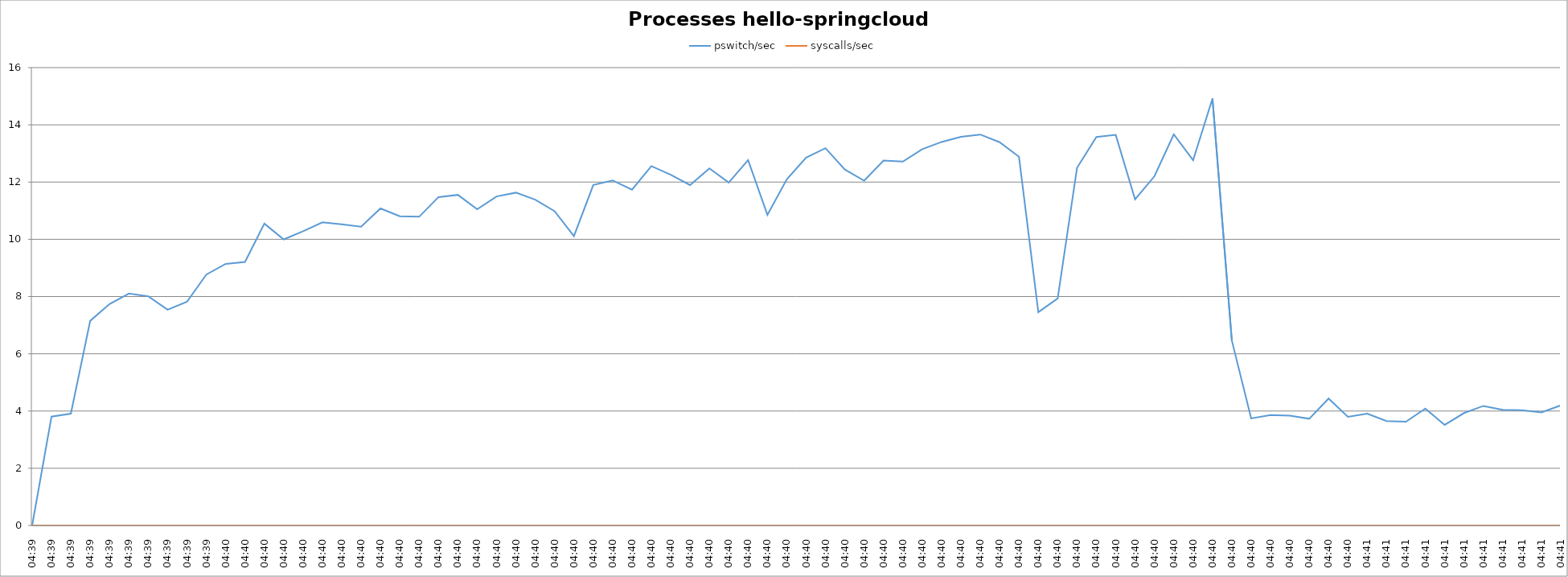
| Category | pswitch/sec | syscalls/sec |
|---|---|---|
| 04:39 | 0 | -1 |
| 04:39 | 3806.2 | -1 |
| 04:39 | 3906.4 | -1 |
| 04:39 | 7152.7 | -1 |
| 04:39 | 7738.4 | -1 |
| 04:39 | 8105 | -1 |
| 04:39 | 8009.9 | -1 |
| 04:39 | 7539.4 | -1 |
| 04:39 | 7815.9 | -1 |
| 04:39 | 8766.7 | -1 |
| 04:40 | 9140 | -1 |
| 04:40 | 9208.2 | -1 |
| 04:40 | 10547 | -1 |
| 04:40 | 9996.9 | -1 |
| 04:40 | 10283.3 | -1 |
| 04:40 | 10594.5 | -1 |
| 04:40 | 10521.5 | -1 |
| 04:40 | 10442.4 | -1 |
| 04:40 | 11078.9 | -1 |
| 04:40 | 10804.9 | -1 |
| 04:40 | 10788.7 | -1 |
| 04:40 | 11476 | -1 |
| 04:40 | 11553.4 | -1 |
| 04:40 | 11048.4 | -1 |
| 04:40 | 11498.2 | -1 |
| 04:40 | 11630.4 | -1 |
| 04:40 | 11384.5 | -1 |
| 04:40 | 10981.8 | -1 |
| 04:40 | 10110.5 | -1 |
| 04:40 | 11899.4 | -1 |
| 04:40 | 12057.8 | -1 |
| 04:40 | 11736 | -1 |
| 04:40 | 12558.3 | -1 |
| 04:40 | 12255.4 | -1 |
| 04:40 | 11894.8 | -1 |
| 04:40 | 12477.2 | -1 |
| 04:40 | 11984.8 | -1 |
| 04:40 | 12768.4 | -1 |
| 04:40 | 10853.5 | -1 |
| 04:40 | 12098 | -1 |
| 04:40 | 12857.5 | -1 |
| 04:40 | 13183.1 | -1 |
| 04:40 | 12439.3 | -1 |
| 04:40 | 12048.7 | -1 |
| 04:40 | 12749.9 | -1 |
| 04:40 | 12717.5 | -1 |
| 04:40 | 13147.6 | -1 |
| 04:40 | 13401.4 | -1 |
| 04:40 | 13584.1 | -1 |
| 04:40 | 13661.5 | -1 |
| 04:40 | 13392.9 | -1 |
| 04:40 | 12884 | -1 |
| 04:40 | 7455.9 | -1 |
| 04:40 | 7935 | -1 |
| 04:40 | 12499.1 | -1 |
| 04:40 | 13572.9 | -1 |
| 04:40 | 13649.4 | -1 |
| 04:40 | 11395.4 | -1 |
| 04:40 | 12202.7 | -1 |
| 04:40 | 13665.8 | -1 |
| 04:40 | 12761.6 | -1 |
| 04:40 | 14918.8 | -1 |
| 04:40 | 6462.7 | -1 |
| 04:40 | 3742.5 | -1 |
| 04:40 | 3856.4 | -1 |
| 04:40 | 3834.9 | -1 |
| 04:40 | 3730.3 | -1 |
| 04:40 | 4435.5 | -1 |
| 04:40 | 3799.5 | -1 |
| 04:41 | 3909.8 | -1 |
| 04:41 | 3650 | -1 |
| 04:41 | 3627.2 | -1 |
| 04:41 | 4084.5 | -1 |
| 04:41 | 3516.2 | -1 |
| 04:41 | 3929 | -1 |
| 04:41 | 4178 | -1 |
| 04:41 | 4042.1 | -1 |
| 04:41 | 4026.1 | -1 |
| 04:41 | 3950.9 | -1 |
| 04:41 | 4197.9 | -1 |